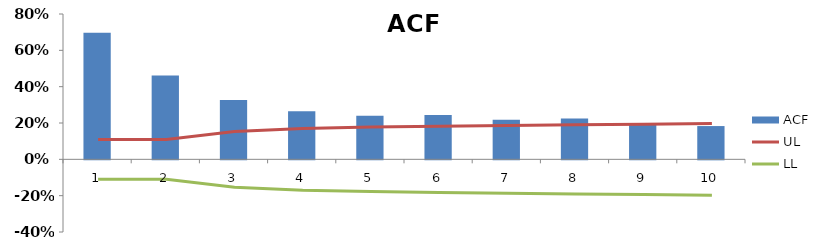
| Category | ACF |
|---|---|
| 0 | 0.697 |
| 1 | 0.461 |
| 2 | 0.326 |
| 3 | 0.265 |
| 4 | 0.239 |
| 5 | 0.244 |
| 6 | 0.218 |
| 7 | 0.225 |
| 8 | 0.199 |
| 9 | 0.183 |